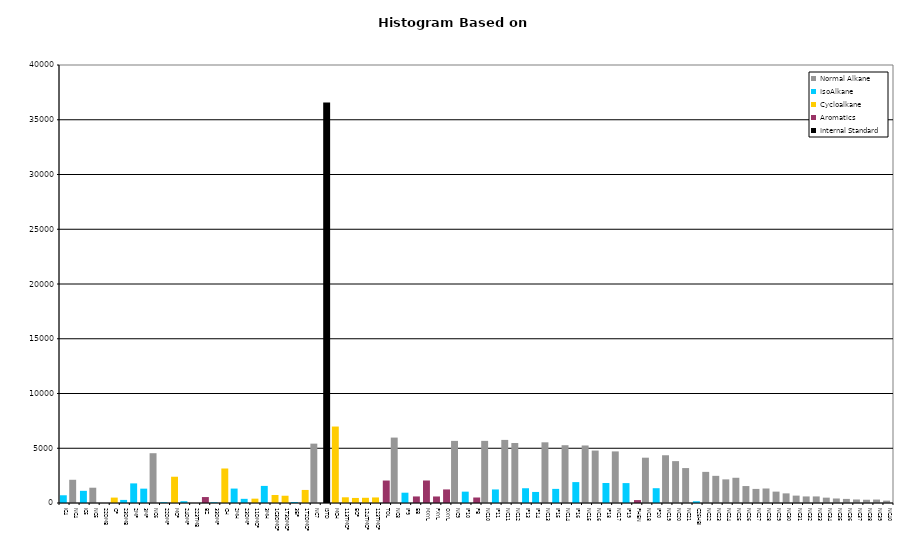
| Category | Normal Alkane | IsoAlkane | Cycloalkane | Aromatics | Internal Standard |
|---|---|---|---|---|---|
| IC4 | 0 | 706 | 0 | 0 | 0 |
| NC4 | 2120 | 0 | 0 | 0 | 0 |
| IC5 | 0 | 1112 | 0 | 0 | 0 |
| NC5 | 1396 | 0 | 0 | 0 | 0 |
| 22DMB | 0 | 0 | 0 | 0 | 0 |
| CP | 0 | 0 | 494 | 0 | 0 |
| 23DMB | 0 | 283 | 0 | 0 | 0 |
| 2MP | 0 | 1791 | 0 | 0 | 0 |
| 3MP | 0 | 1311 | 0 | 0 | 0 |
| NC6 | 4547 | 0 | 0 | 0 | 0 |
| 22DMP | 0 | 75 | 0 | 0 | 0 |
| MCP | 0 | 0 | 2399 | 0 | 0 |
| 24DMP | 0 | 163 | 0 | 0 | 0 |
| 223TMB | 0 | 0 | 0 | 0 | 0 |
| BZ | 0 | 0 | 0 | 543 | 0 |
| 33DMP | 0 | 65 | 0 | 0 | 0 |
| CH | 0 | 0 | 3151 | 0 | 0 |
| 2MH | 0 | 1318 | 0 | 0 | 0 |
| 23DMP | 0 | 380 | 0 | 0 | 0 |
| 11DMCP | 0 | 0 | 397 | 0 | 0 |
| 3MH | 0 | 1561 | 0 | 0 | 0 |
| 1C3DMCP | 0 | 0 | 733 | 0 | 0 |
| 1T3DMCP | 0 | 0 | 664 | 0 | 0 |
| 3EP | 0 | 93 | 0 | 0 | 0 |
| 1T2DMCP | 0 | 0 | 1193 | 0 | 0 |
| NC7 | 5421 | 0 | 0 | 0 | 0 |
| ISTD | 0 | 0 | 0 | 0 | 36573 |
| MCH | 0 | 0 | 6983 | 0 | 0 |
| 113TMCP | 0 | 0 | 521 | 0 | 0 |
| ECP | 0 | 0 | 461 | 0 | 0 |
| 124TMCP | 0 | 0 | 476 | 0 | 0 |
| 123TMCP | 0 | 0 | 507 | 0 | 0 |
| TOL | 0 | 0 | 0 | 2052 | 0 |
| NC8 | 5974 | 0 | 0 | 0 | 0 |
| IP9 | 0 | 941 | 0 | 0 | 0 |
| EB | 0 | 0 | 0 | 599 | 0 |
| MXYL | 0 | 0 | 0 | 2056 | 0 |
| PXYL | 0 | 0 | 0 | 596 | 0 |
| OXYL | 0 | 0 | 0 | 1239 | 0 |
| NC9 | 5672 | 0 | 0 | 0 | 0 |
| IP10 | 0 | 1037 | 0 | 0 | 0 |
| PB | 0 | 0 | 0 | 502 | 0 |
| NC10 | 5674 | 0 | 0 | 0 | 0 |
| IP11 | 0 | 1238 | 0 | 0 | 0 |
| NC11 | 5762 | 0 | 0 | 0 | 0 |
| NC12 | 5477 | 0 | 0 | 0 | 0 |
| IP13 | 0 | 1347 | 0 | 0 | 0 |
| IP14 | 0 | 1009 | 0 | 0 | 0 |
| NC13 | 5542 | 0 | 0 | 0 | 0 |
| IP15 | 0 | 1289 | 0 | 0 | 0 |
| NC14 | 5278 | 0 | 0 | 0 | 0 |
| IP16 | 0 | 1909 | 0 | 0 | 0 |
| NC15 | 5253 | 0 | 0 | 0 | 0 |
| NC16 | 4790 | 0 | 0 | 0 | 0 |
| IP18 | 0 | 1826 | 0 | 0 | 0 |
| NC17 | 4712 | 0 | 0 | 0 | 0 |
| IP19 | 0 | 1818 | 0 | 0 | 0 |
| PHEN | 0 | 0 | 0 | 267 | 0 |
| NC18 | 4138 | 0 | 0 | 0 | 0 |
| IP20 | 0 | 1351 | 0 | 0 | 0 |
| NC19 | 4361 | 0 | 0 | 0 | 0 |
| NC20 | 3824 | 0 | 0 | 0 | 0 |
| NC21 | 3190 | 0 | 0 | 0 | 0 |
| C25HBI | 0 | 158 | 0 | 0 | 0 |
| NC22 | 2842 | 0 | 0 | 0 | 0 |
| NC23 | 2480 | 0 | 0 | 0 | 0 |
| NC24 | 2158 | 0 | 0 | 0 | 0 |
| NC25 | 2304 | 0 | 0 | 0 | 0 |
| NC26 | 1548 | 0 | 0 | 0 | 0 |
| NC27 | 1286 | 0 | 0 | 0 | 0 |
| NC28 | 1325 | 0 | 0 | 0 | 0 |
| NC29 | 1039 | 0 | 0 | 0 | 0 |
| NC30 | 879 | 0 | 0 | 0 | 0 |
| NC31 | 675 | 0 | 0 | 0 | 0 |
| NC32 | 600 | 0 | 0 | 0 | 0 |
| NC33 | 601 | 0 | 0 | 0 | 0 |
| NC34 | 489 | 0 | 0 | 0 | 0 |
| NC35 | 412 | 0 | 0 | 0 | 0 |
| NC36 | 374 | 0 | 0 | 0 | 0 |
| NC37 | 322 | 0 | 0 | 0 | 0 |
| NC38 | 298 | 0 | 0 | 0 | 0 |
| NC39 | 315 | 0 | 0 | 0 | 0 |
| NC40 | 216 | 0 | 0 | 0 | 0 |